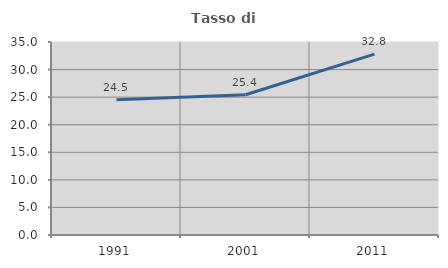
| Category | Tasso di occupazione   |
|---|---|
| 1991.0 | 24.535 |
| 2001.0 | 25.442 |
| 2011.0 | 32.8 |